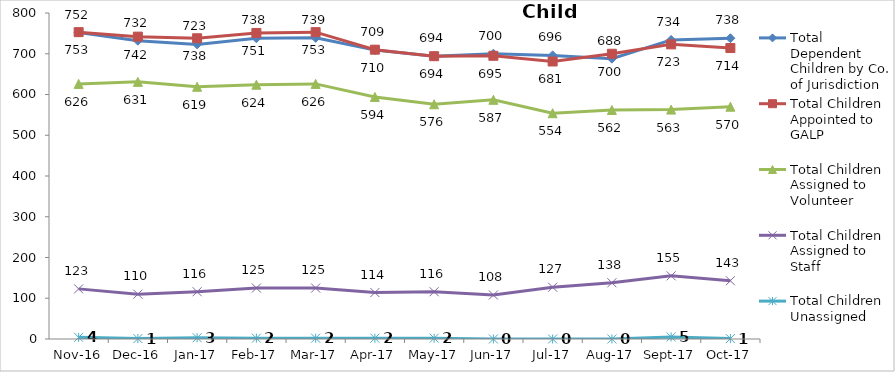
| Category | Total Dependent Children by Co. of Jurisdiction | Total Children Appointed to GALP | Total Children Assigned to Volunteer | Total Children Assigned to Staff | Total Children Unassigned |
|---|---|---|---|---|---|
| 2016-11-01 | 752 | 753 | 626 | 123 | 4 |
| 2016-12-01 | 732 | 742 | 631 | 110 | 1 |
| 2017-01-01 | 723 | 738 | 619 | 116 | 3 |
| 2017-02-01 | 738 | 751 | 624 | 125 | 2 |
| 2017-03-01 | 739 | 753 | 626 | 125 | 2 |
| 2017-04-01 | 709 | 710 | 594 | 114 | 2 |
| 2017-05-01 | 694 | 694 | 576 | 116 | 2 |
| 2017-06-01 | 700 | 695 | 587 | 108 | 0 |
| 2017-07-01 | 696 | 681 | 554 | 127 | 0 |
| 2017-08-01 | 688 | 700 | 562 | 138 | 0 |
| 2017-09-01 | 734 | 723 | 563 | 155 | 5 |
| 2017-10-01 | 738 | 714 | 570 | 143 | 1 |